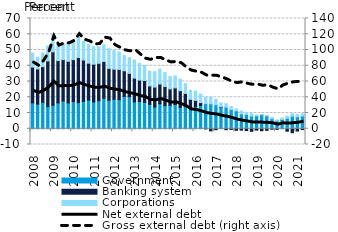
| Category | Government | Banking system | Corporations |
|---|---|---|---|
| 2008.0 | 16.404 | 22.716 | 8.916 |
| 2008.0 | 15.651 | 22.33 | 7.473 |
| 2008.0 | 16.846 | 22.574 | 8.679 |
| 2008.0 | 14.047 | 29.01 | 9.502 |
| 2009.0 | 14.927 | 33.904 | 11.038 |
| 2009.0 | 16.435 | 26.85 | 10.53 |
| 2009.0 | 17.608 | 26.295 | 10.365 |
| 2009.0 | 16.398 | 26.403 | 11.301 |
| 2010.0 | 17.255 | 26.623 | 11.141 |
| 2010.0 | 16.586 | 28.619 | 12.8 |
| 2010.0 | 17.396 | 26.247 | 11.943 |
| 2010.0 | 18.186 | 23.436 | 12.044 |
| 2011.0 | 17.018 | 23.982 | 11.128 |
| 2011.0 | 17.848 | 23.686 | 10.523 |
| 2011.0 | 19.355 | 23.299 | 10.756 |
| 2011.0 | 18.123 | 20.182 | 12.535 |
| 2012.0 | 18.711 | 19.086 | 11.985 |
| 2012.0 | 18.542 | 19.118 | 11.122 |
| 2012.0 | 20.485 | 16.328 | 9.677 |
| 2012.0 | 20.399 | 14.794 | 9.937 |
| 2013.0 | 17.014 | 15.132 | 11.498 |
| 2013.0 | 17.267 | 13.644 | 10.603 |
| 2013.0 | 16.727 | 13.883 | 9.595 |
| 2013.0 | 15.423 | 11.741 | 9.384 |
| 2014.0 | 13.76 | 12.681 | 9.756 |
| 2014.0 | 15.888 | 12.483 | 9.449 |
| 2014.0 | 14.705 | 12.088 | 8.842 |
| 2014.0 | 14.922 | 10.372 | 7.872 |
| 2015.0 | 15.37 | 10.579 | 7.624 |
| 2015.0 | 13.624 | 10.549 | 7.235 |
| 2015.0 | 14.065 | 8.353 | 6.201 |
| 2015.0 | 12.996 | 5.69 | 5.765 |
| 2016.0 | 14.055 | 3.979 | 5.863 |
| 2016.0 | 14.798 | 1.823 | 5.445 |
| 2016.0 | 15.971 | -0.067 | 4.052 |
| 2016.0 | 15.867 | -1.368 | 4.315 |
| 2017.0 | 15.231 | -0.62 | 3.472 |
| 2017.0 | 13.528 | 0.345 | 2.53 |
| 2017.0 | 13.75 | -0.604 | 2.174 |
| 2017.0 | 12.159 | -0.428 | 1.882 |
| 2018.0 | 11.383 | -1 | 1.254 |
| 2018.0 | 9.434 | -0.888 | 1.804 |
| 2018.0 | 9.127 | -1.152 | 1.259 |
| 2018.0 | 8.072 | -1.636 | 1.565 |
| 2019.0 | 8.244 | -0.873 | 0.521 |
| 2019.0 | 8.912 | -1.26 | 0.111 |
| 2019.0 | 8.162 | -1.017 | 0.355 |
| 2019.0 | 6.424 | -0.295 | 0.768 |
| 2020.0 | 5.032 | -0.373 | 0.537 |
| 2020.0 | 5.588 | 0.138 | 1.176 |
| 2020.0 | 6.669 | -1.579 | 1.388 |
| 2020.0 | 8.014 | -2.525 | 1.546 |
| 2021.0 | 7.61 | -1.452 | 1.507 |
| 2021.0 | 8.068 | -0.523 | 1.398 |